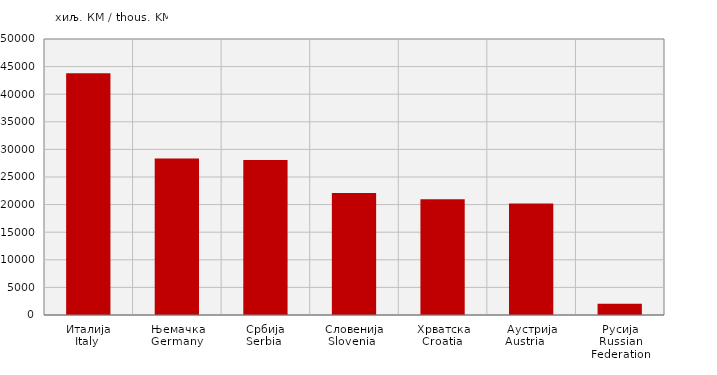
| Category | Извоз
Export |
|---|---|
| Италија
Italy  | 43817 |
| Њемачка
Germany  | 28345 |
| Србија
Serbia  | 28067 |
| Словенија
Slovenia   | 22116 |
| Хрватска
Croatia  | 20961 |
| Аустрија
Austria     | 20179 |
| Русија
Russian Federation | 2054 |